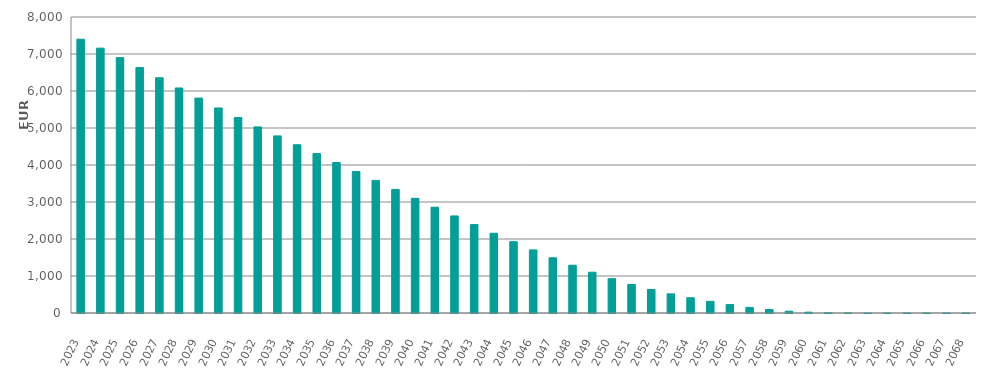
| Category | EUR Millions |
|---|---|
| 2023.0 | 7400000098.98 |
| 2024.0 | 7158306391.298 |
| 2025.0 | 6901202732.794 |
| 2026.0 | 6632795017.174 |
| 2027.0 | 6358000395.089 |
| 2028.0 | 6081305996.517 |
| 2029.0 | 5808237459.699 |
| 2030.0 | 5541614445.407 |
| 2031.0 | 5282247694.469 |
| 2032.0 | 5030098293.949 |
| 2033.0 | 4786811463.383 |
| 2034.0 | 4547530781.87 |
| 2035.0 | 4308208430.588 |
| 2036.0 | 4066815239.517 |
| 2037.0 | 3825958626.63 |
| 2038.0 | 3584132708.748 |
| 2039.0 | 3340604191.634 |
| 2040.0 | 3098929383.73 |
| 2041.0 | 2859732681.199 |
| 2042.0 | 2623327928.727 |
| 2043.0 | 2389076017.302 |
| 2044.0 | 2155846631.362 |
| 2045.0 | 1927545274.458 |
| 2046.0 | 1705210741.397 |
| 2047.0 | 1492303841.408 |
| 2048.0 | 1291256733.663 |
| 2049.0 | 1102439750.546 |
| 2050.0 | 928431589.915 |
| 2051.0 | 772304778.283 |
| 2052.0 | 635301266.243 |
| 2053.0 | 517631361 |
| 2054.0 | 412117195.805 |
| 2055.0 | 315340105.387 |
| 2056.0 | 227993041.962 |
| 2057.0 | 151498666.744 |
| 2058.0 | 92174294.031 |
| 2059.0 | 48676834.364 |
| 2060.0 | 21719422.477 |
| 2061.0 | 7077715.325 |
| 2062.0 | 987118.918 |
| 2063.0 | 87143.161 |
| 2064.0 | 58846.628 |
| 2065.0 | 37837.008 |
| 2066.0 | 24036.617 |
| 2067.0 | 16090.366 |
| 2068.0 | 7882.713 |